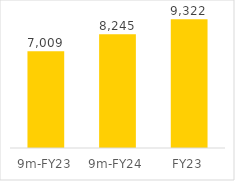
| Category | Series 0 |
|---|---|
| 9m-FY23 | 7009.211 |
| 9m-FY24 | 8244.935 |
| FY23 | 9322.183 |